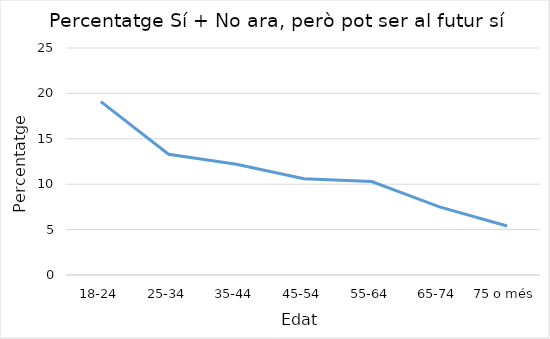
| Category | Series 0 |
|---|---|
| 18-24 | 19.1 |
| 25-34 | 13.3 |
| 35-44 | 12.2 |
| 45-54 | 10.6 |
| 55-64 | 10.3 |
| 65-74 | 7.5 |
| 75 o més | 5.4 |